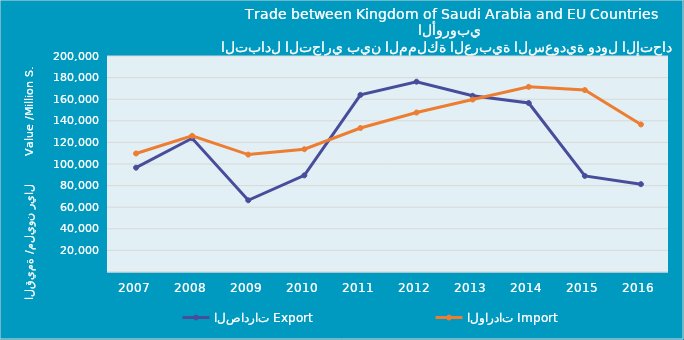
| Category | الصادرات | الواردات |
|---|---|---|
| 2007.0 | 96589567347 | 109742020646 |
| 2008.0 | 123842358569 | 126076788324 |
| 2009.0 | 66424449943 | 108706870724 |
| 2010.0 | 89473272822 | 113673694057 |
| 2011.0 | 163984710171 | 133338217916 |
| 2012.0 | 176214374025 | 147655229181 |
| 2013.0 | 163153758917 | 159668962902 |
| 2014.0 | 156468256094 | 171440173149 |
| 2015.0 | 88997074905 | 168482820598 |
| 2016.0 | 81310614558 | 136611121499 |